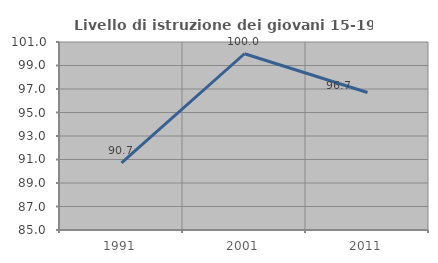
| Category | Livello di istruzione dei giovani 15-19 anni |
|---|---|
| 1991.0 | 90.722 |
| 2001.0 | 100 |
| 2011.0 | 96.703 |